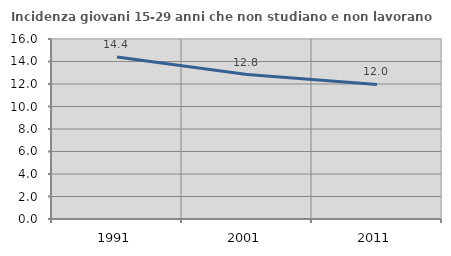
| Category | Incidenza giovani 15-29 anni che non studiano e non lavorano  |
|---|---|
| 1991.0 | 14.407 |
| 2001.0 | 12.844 |
| 2011.0 | 11.966 |